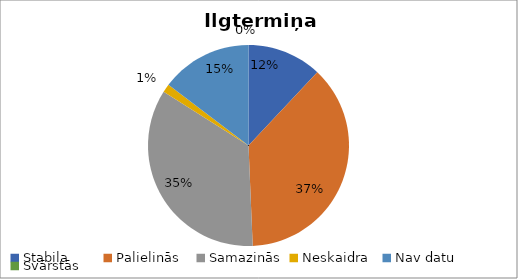
| Category | Ilgtermiņa (aizsargājamie) |
|---|---|
| Stabila | 9 |
| Palielinās | 28 |
| Samazinās | 26 |
| Neskaidra | 1 |
| Nav datu | 11 |
| Svārstās | 0 |